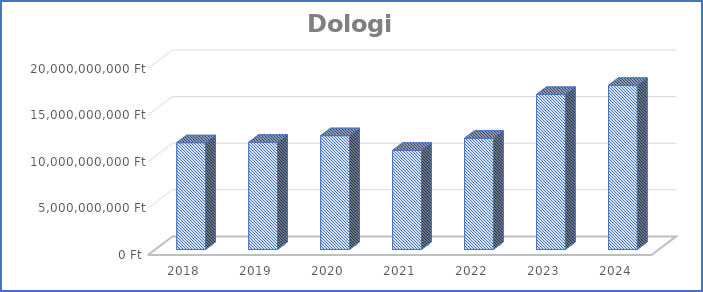
| Category | Dologi kiadások |
|---|---|
| 2018.0 | 11449608652 |
| 2019.0 | 11499372534 |
| 2020.0 | 12208492414 |
| 2021.0 | 10633273898 |
| 2022.0 | 11934219707 |
| 2023.0 | 16631759826 |
| 2024.0 | 17607210157 |